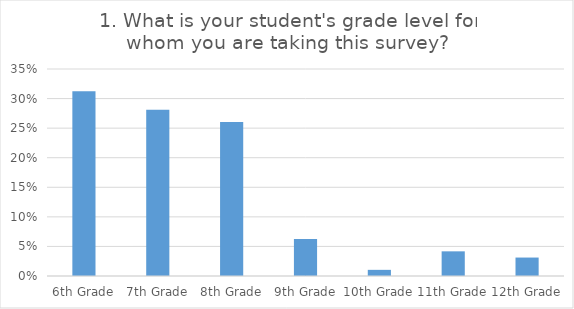
| Category | 1. What is your student's grade level for whom you are taking this survey?  |
|---|---|
| 6th Grade | 0.312 |
| 7th Grade | 0.281 |
| 8th Grade | 0.26 |
| 9th Grade | 0.062 |
| 10th Grade | 0.01 |
| 11th Grade | 0.042 |
| 12th Grade | 0.031 |